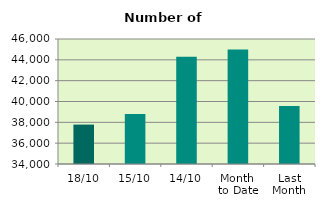
| Category | Series 0 |
|---|---|
| 18/10 | 37784 |
| 15/10 | 38802 |
| 14/10 | 44288 |
| Month 
to Date | 44998.333 |
| Last
Month | 39557.091 |